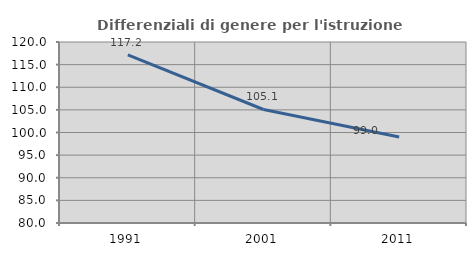
| Category | Differenziali di genere per l'istruzione superiore |
|---|---|
| 1991.0 | 117.169 |
| 2001.0 | 105.086 |
| 2011.0 | 98.987 |